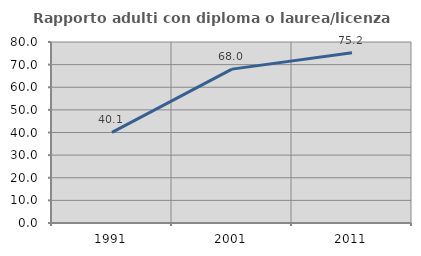
| Category | Rapporto adulti con diploma o laurea/licenza media  |
|---|---|
| 1991.0 | 40.079 |
| 2001.0 | 68.012 |
| 2011.0 | 75.249 |